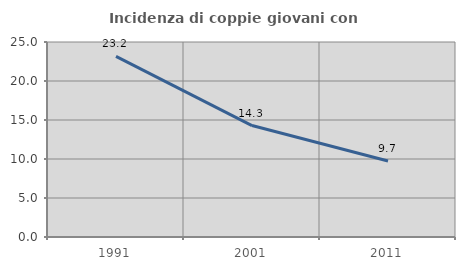
| Category | Incidenza di coppie giovani con figli |
|---|---|
| 1991.0 | 23.155 |
| 2001.0 | 14.286 |
| 2011.0 | 9.749 |